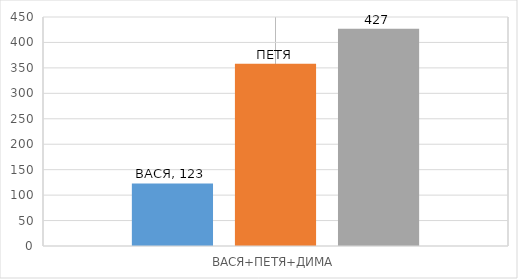
| Category | ВАСЯ | ПЕТЯ | ДИМА |
|---|---|---|---|
| ВАСЯ+ПЕТЯ+ДИМА | 123 | 358 | 427 |